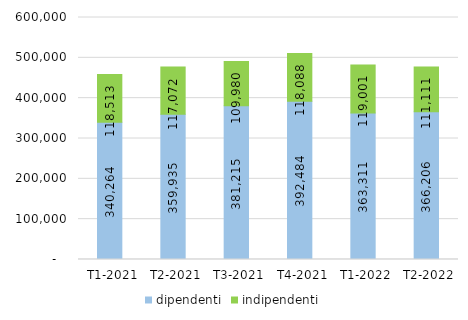
| Category | dipendenti | indipendenti |
|---|---|---|
|   T1-2021 | 340264 | 118513 |
|   T2-2021 | 359935 | 117072 |
|   T3-2021 | 381215 | 109980 |
|   T4-2021 | 392484 | 118088 |
|   T1-2022 | 363311 | 119001 |
|   T2-2022 | 366206 | 111111 |